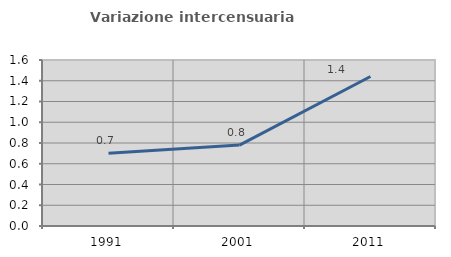
| Category | Variazione intercensuaria annua |
|---|---|
| 1991.0 | 0.702 |
| 2001.0 | 0.78 |
| 2011.0 | 1.441 |